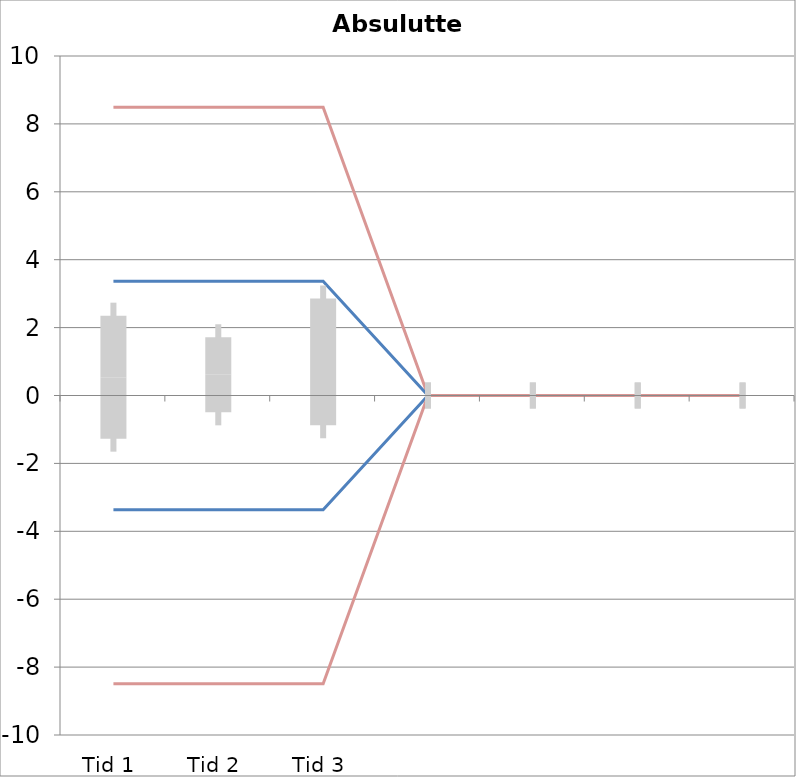
| Category | 1 | 2 | 3 | 4 | 5 | 6 | 7 | 8 | 9 | 10 | 11 | 12 | 13 | 14 | 15 | 16 | 17 | 18 | 19 | 20 | TEa | B | -B | -TEa | M |
|---|---|---|---|---|---|---|---|---|---|---|---|---|---|---|---|---|---|---|---|---|---|---|---|---|---|
| Tid 1 | -2.1 | -0.2 | 1.7 | 5.3 | -1.1 | 2.8 | 0.5 | -0.6 | -3.2 | 2.3 | 0 | 0 | 0 | 0 | 0 | 0 | 0 | 0 | 0 | 0 | 8.488 | 3.369 | -3.369 | -8.488 | 0.54 |
| Tid 2 | -1.7 | 0.1 | 1.7 | 2.3 | -0.1 | 2.8 | 0.3 | -0.4 | -1.1 | 2.2 | 0 | 0 | 0 | 0 | 0 | 0 | 0 | 0 | 0 | 0 | 8.488 | 3.369 | -3.369 | -8.488 | 0.61 |
| Tid 3 | -0.7 | 0.4 | 1.7 | 5.7 | 1 | 2.4 | 0.4 | 2.3 | -4.6 | 1.3 | 0 | 0 | 0 | 0 | 0 | 0 | 0 | 0 | 0 | 0 | 8.488 | 3.369 | -3.369 | -8.488 | 0.99 |